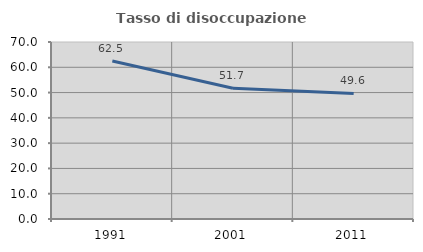
| Category | Tasso di disoccupazione giovanile  |
|---|---|
| 1991.0 | 62.487 |
| 2001.0 | 51.675 |
| 2011.0 | 49.637 |